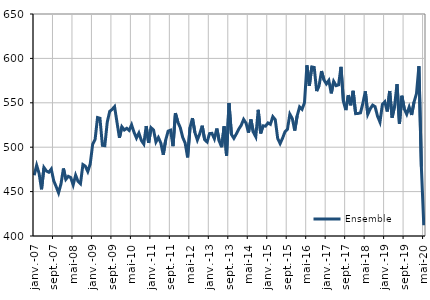
| Category | Ensemble |
|---|---|
| 2007-01-01 | 468.4 |
| 2007-02-01 | 479.6 |
| 2007-03-01 | 470.5 |
| 2007-04-01 | 452.6 |
| 2007-05-01 | 477.1 |
| 2007-06-01 | 473.2 |
| 2007-07-01 | 471.8 |
| 2007-08-01 | 475.4 |
| 2007-09-01 | 462.3 |
| 2007-10-01 | 455.7 |
| 2007-11-01 | 448.6 |
| 2007-12-01 | 458.7 |
| 2008-01-01 | 476 |
| 2008-02-01 | 463.8 |
| 2008-03-01 | 467.2 |
| 2008-04-01 | 465.8 |
| 2008-05-01 | 457.5 |
| 2008-06-01 | 468.5 |
| 2008-07-01 | 461.5 |
| 2008-08-01 | 458.9 |
| 2008-09-01 | 480.4 |
| 2008-10-01 | 478.6 |
| 2008-11-01 | 472.6 |
| 2008-12-01 | 481.1 |
| 2009-01-01 | 503.3 |
| 2009-02-01 | 508.6 |
| 2009-03-01 | 533.4 |
| 2009-04-01 | 532.6 |
| 2009-05-01 | 502.1 |
| 2009-06-01 | 501.7 |
| 2009-07-01 | 528.3 |
| 2009-08-01 | 540.3 |
| 2009-09-01 | 542.6 |
| 2009-10-01 | 545.7 |
| 2009-11-01 | 528 |
| 2009-12-01 | 510.6 |
| 2010-01-01 | 523 |
| 2010-02-01 | 519.4 |
| 2010-03-01 | 521.3 |
| 2010-04-01 | 518.9 |
| 2010-05-01 | 525.2 |
| 2010-06-01 | 516.8 |
| 2010-07-01 | 510.3 |
| 2010-08-01 | 515.9 |
| 2010-09-01 | 507.6 |
| 2010-10-01 | 503.6 |
| 2010-11-01 | 523.8 |
| 2010-12-01 | 504.8 |
| 2011-01-01 | 521.9 |
| 2011-02-01 | 519.4 |
| 2011-03-01 | 505.9 |
| 2011-04-01 | 510.9 |
| 2011-05-01 | 504.7 |
| 2011-06-01 | 491.5 |
| 2011-07-01 | 508.1 |
| 2011-08-01 | 518.1 |
| 2011-09-01 | 519.2 |
| 2011-10-01 | 501.1 |
| 2011-11-01 | 538.3 |
| 2011-12-01 | 528.2 |
| 2012-01-01 | 522 |
| 2012-02-01 | 511 |
| 2012-03-01 | 504.6 |
| 2012-04-01 | 488.5 |
| 2012-05-01 | 522.2 |
| 2012-06-01 | 532.6 |
| 2012-07-01 | 516.6 |
| 2012-08-01 | 508.1 |
| 2012-09-01 | 515.2 |
| 2012-10-01 | 524.2 |
| 2012-11-01 | 508.4 |
| 2012-12-01 | 505.9 |
| 2013-01-01 | 515.3 |
| 2013-02-01 | 515.6 |
| 2013-03-01 | 509.5 |
| 2013-04-01 | 521 |
| 2013-05-01 | 506.9 |
| 2013-06-01 | 500 |
| 2013-07-01 | 523.5 |
| 2013-08-01 | 490.5 |
| 2013-09-01 | 549.6 |
| 2013-10-01 | 514.4 |
| 2013-11-01 | 510 |
| 2013-12-01 | 514.9 |
| 2014-01-01 | 520.4 |
| 2014-02-01 | 524.6 |
| 2014-03-01 | 531.3 |
| 2014-04-01 | 527.1 |
| 2014-05-01 | 516.4 |
| 2014-06-01 | 531.2 |
| 2014-07-01 | 516.9 |
| 2014-08-01 | 511.7 |
| 2014-09-01 | 542.1 |
| 2014-10-01 | 515.5 |
| 2014-11-01 | 524.1 |
| 2014-12-01 | 523.7 |
| 2015-01-01 | 527.3 |
| 2015-02-01 | 525.8 |
| 2015-03-01 | 534.4 |
| 2015-04-01 | 531 |
| 2015-05-01 | 509.9 |
| 2015-06-01 | 504.1 |
| 2015-07-01 | 510.2 |
| 2015-08-01 | 517.4 |
| 2015-09-01 | 520.2 |
| 2015-10-01 | 537.2 |
| 2015-11-01 | 532.2 |
| 2015-12-01 | 518.7 |
| 2016-01-01 | 535.4 |
| 2016-02-01 | 545.3 |
| 2016-03-01 | 542.6 |
| 2016-04-01 | 550.1 |
| 2016-05-01 | 592.2 |
| 2016-06-01 | 569.1 |
| 2016-07-01 | 590.4 |
| 2016-08-01 | 589.8 |
| 2016-09-01 | 563.2 |
| 2016-10-01 | 569.5 |
| 2016-11-01 | 585.7 |
| 2016-12-01 | 575.8 |
| 2017-01-01 | 571.3 |
| 2017-02-01 | 575.2 |
| 2017-03-01 | 560.6 |
| 2017-04-01 | 574.1 |
| 2017-05-01 | 569.3 |
| 2017-06-01 | 570.2 |
| 2017-07-01 | 590.5 |
| 2017-08-01 | 551.5 |
| 2017-09-01 | 541.8 |
| 2017-10-01 | 558.7 |
| 2017-11-01 | 547.2 |
| 2017-12-01 | 563.5 |
| 2018-01-01 | 537.8 |
| 2018-02-01 | 538 |
| 2018-03-01 | 538.7 |
| 2018-04-01 | 549.7 |
| 2018-05-01 | 562.9 |
| 2018-06-01 | 537.1 |
| 2018-07-01 | 543.2 |
| 2018-08-01 | 547.4 |
| 2018-09-01 | 545.6 |
| 2018-10-01 | 535 |
| 2018-11-01 | 528.3 |
| 2018-12-01 | 548.2 |
| 2019-01-01 | 551.1 |
| 2019-02-01 | 540.2 |
| 2019-03-01 | 563.3 |
| 2019-04-01 | 533.3 |
| 2019-05-01 | 546.3 |
| 2019-06-01 | 571 |
| 2019-07-01 | 526.3 |
| 2019-08-01 | 557.9 |
| 2019-09-01 | 543.1 |
| 2019-10-01 | 537.1 |
| 2019-11-01 | 545.1 |
| 2019-12-01 | 536.3 |
| 2020-01-01 | 550.9 |
| 2020-02-01 | 560.4 |
| 2020-03-01 | 591.2 |
| 2020-04-01 | 478.1 |
| 2020-05-01 | 412.1 |